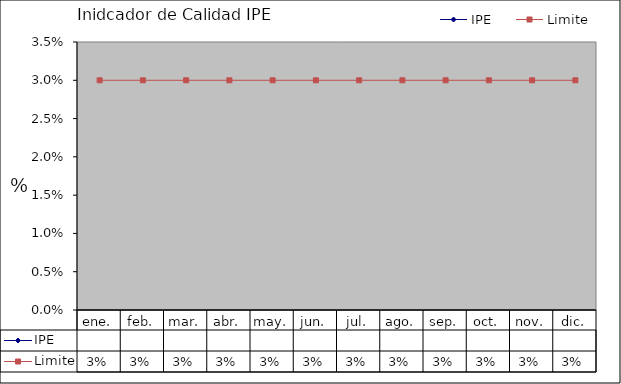
| Category | IPE | Limite |
|---|---|---|
| ene. |  | 0.03 |
| feb. |  | 0.03 |
| mar. |  | 0.03 |
| abr. |  | 0.03 |
| may. |  | 0.03 |
| jun. |  | 0.03 |
| jul. |  | 0.03 |
| ago. |  | 0.03 |
| sep. |  | 0.03 |
| oct. |  | 0.03 |
| nov. |  | 0.03 |
| dic. |  | 0.03 |